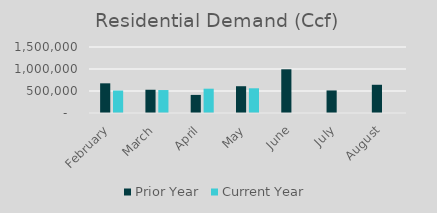
| Category | Prior Year | Current Year |
|---|---|---|
| February | 674439.428 | 510296.309 |
| March | 528549.791 | 521893.674 |
| April | 411179.62 | 552550.404 |
| May | 608563.54 | 561680.927 |
| June | 993563.54 | 0 |
| July | 512849.55 | 0 |
| August | 641515.25 | 0 |